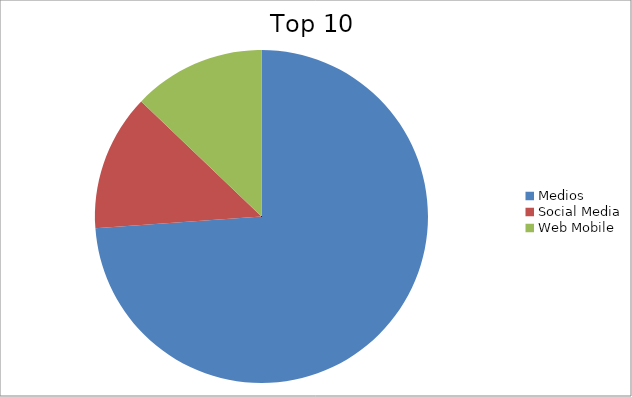
| Category | Series 0 |
|---|---|
| Medios | 73.87 |
| Social Media | 13.28 |
| Web Mobile | 12.85 |